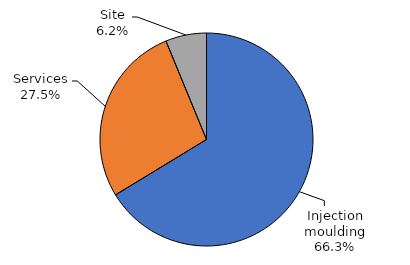
| Category | Series 0 |
|---|---|
| Injection moulding | 0.663 |
| Services | 0.275 |
| Site | 0.062 |